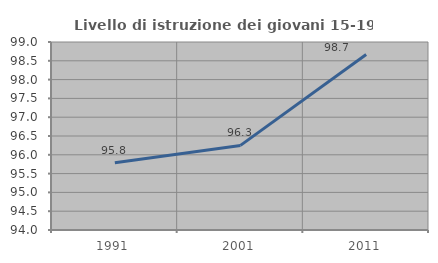
| Category | Livello di istruzione dei giovani 15-19 anni |
|---|---|
| 1991.0 | 95.789 |
| 2001.0 | 96.25 |
| 2011.0 | 98.667 |